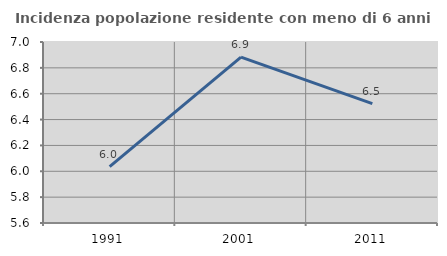
| Category | Incidenza popolazione residente con meno di 6 anni |
|---|---|
| 1991.0 | 6.036 |
| 2001.0 | 6.884 |
| 2011.0 | 6.523 |